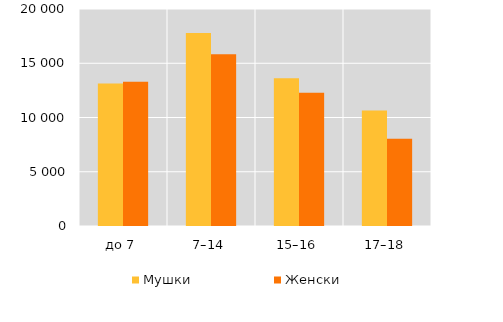
| Category | Мушки | Женски |
|---|---|---|
| до 7 | 13127 | 13299 |
| 7–14 | 17789 | 15840 |
| 15–16 | 13610 | 12278 |
| 17–18 | 10642 | 8030 |